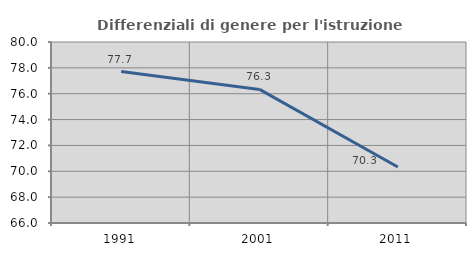
| Category | Differenziali di genere per l'istruzione superiore |
|---|---|
| 1991.0 | 77.714 |
| 2001.0 | 76.333 |
| 2011.0 | 70.328 |